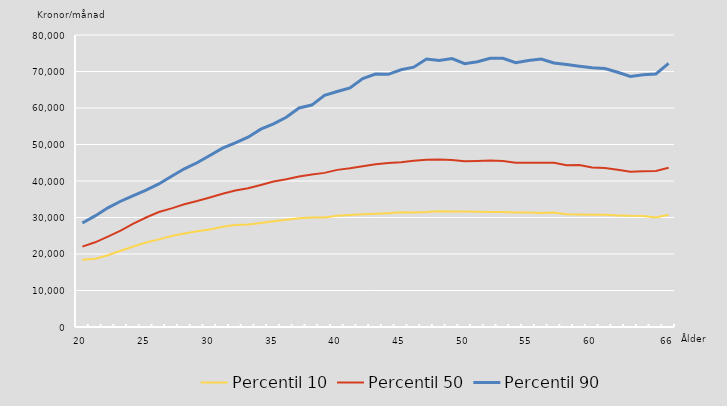
| Category | Percentil 10 | Percentil 50 | Percentil 90 |
|---|---|---|---|
| 20.0 | 18447.862 | 22030.866 | 28500 |
| nan | 18702 | 23200 | 30434.662 |
| nan | 19662 | 24770.18 | 32655.762 |
| nan | 20880 | 26411.325 | 34456.75 |
| nan | 22057.98 | 28344.143 | 36000 |
| 25.0 | 23142 | 30000 | 37500 |
| nan | 24000 | 31500 | 39200 |
| nan | 24954.812 | 32501 | 41322.988 |
| nan | 25590 | 33634 | 43340.925 |
| nan | 26239.2 | 34500 | 45000 |
| 30.0 | 26731.068 | 35500 | 47000 |
| nan | 27440.198 | 36500 | 49000 |
| nan | 27928 | 37400 | 50436.412 |
| nan | 28051.25 | 38000 | 52000 |
| nan | 28500 | 38898.038 | 54200 |
| 35.0 | 29000 | 39854.638 | 55665.75 |
| nan | 29393 | 40485.675 | 57467.45 |
| nan | 29767.525 | 41208.1 | 60000 |
| nan | 30000 | 41750 | 60800 |
| nan | 30000 | 42223.714 | 63458.225 |
| 40.0 | 30472.575 | 43050 | 64522 |
| nan | 30672.888 | 43500 | 65520 |
| nan | 30888.792 | 44071.25 | 68074 |
| nan | 31000 | 44579 | 69293.775 |
| nan | 31184.338 | 44924 | 69230.788 |
| 45.0 | 31422.208 | 45147.967 | 70485.25 |
| nan | 31393.825 | 45558 | 71185 |
| nan | 31500 | 45824.038 | 73433.75 |
| nan | 31700 | 45900 | 73000 |
| nan | 31630 | 45762.475 | 73557 |
| 50.0 | 31620 | 45392.112 | 72120 |
| nan | 31598 | 45500 | 72659.75 |
| nan | 31480 | 45611.075 | 73641.188 |
| nan | 31500 | 45496.862 | 73603.562 |
| nan | 31378 | 45000 | 72432.988 |
| 55.0 | 31381.562 | 45000 | 73000 |
| nan | 31200 | 44982.975 | 73400 |
| nan | 31350.549 | 45000 | 72353.875 |
| nan | 30900 | 44300 | 71911.888 |
| nan | 30850 | 44371.912 | 71447.85 |
| 60.0 | 30762.662 | 43701.438 | 71000 |
| nan | 30738 | 43565 | 70803.662 |
| nan | 30564.788 | 43084 | 69784.9 |
| nan | 30450 | 42510 | 68650 |
| nan | 30442.823 | 42665 | 69102.788 |
| nan | 30026.25 | 42724.638 | 69338.562 |
| 66.0 | 30769 | 43610 | 72216 |